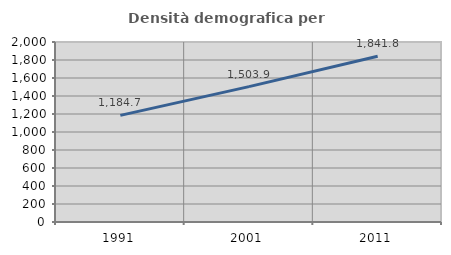
| Category | Densità demografica |
|---|---|
| 1991.0 | 1184.695 |
| 2001.0 | 1503.934 |
| 2011.0 | 1841.848 |